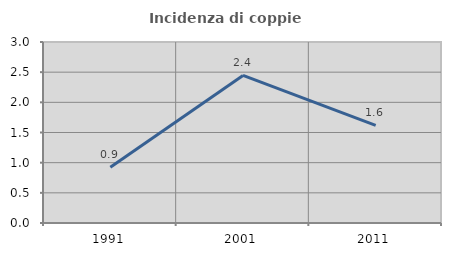
| Category | Incidenza di coppie miste |
|---|---|
| 1991.0 | 0.923 |
| 2001.0 | 2.446 |
| 2011.0 | 1.617 |